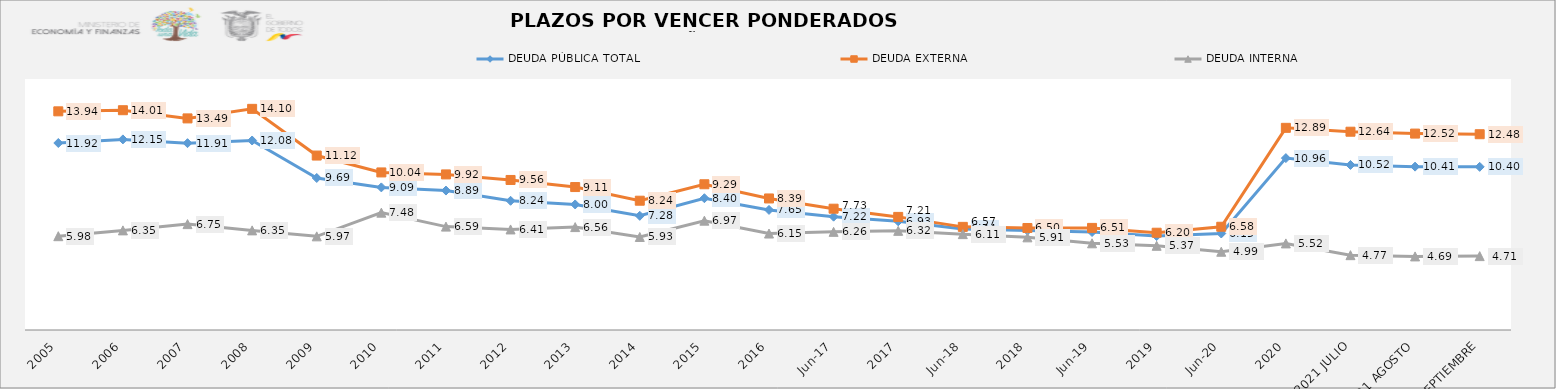
| Category | DEUDA PÚBLICA TOTAL | DEUDA EXTERNA  | DEUDA INTERNA |
|---|---|---|---|
| 2005 | 11.92 | 13.939 | 5.98 |
| 2006 | 12.15 | 14.01 | 6.35 |
| 2007 | 11.91 | 13.489 | 6.75 |
| 2008 | 12.08 | 14.097 | 6.35 |
| 2009 | 9.69 | 11.12 | 5.97 |
| 2010 | 9.09 | 10.045 | 7.48 |
| 2011 | 8.889 | 9.918 | 6.59 |
| 2012 | 8.237 | 9.564 | 6.41 |
| 2013 | 8.003 | 9.112 | 6.56 |
| 2014 | 7.278 | 8.241 | 5.93 |
| 2015 | 8.401 | 9.29 | 6.969 |
| 2016 | 7.655 | 8.385 | 6.149 |
| jun-17 | 7.224 | 7.733 | 6.257 |
| 2017 | 6.927 | 7.21 | 6.32 |
| jun-18 | 6.439 | 6.574 | 6.111 |
| 2018 | 6.337 | 6.503 | 5.906 |
| jun-19 | 6.246 | 6.509 | 5.526 |
| 2019 | 5.988 | 6.201 | 5.368 |
| jun-20 | 6.152 | 6.581 | 4.989 |
| 2020 | 10.957 | 12.887 | 5.519 |
| 2021 JULIO | 10.52 | 12.64 | 4.77 |
| 2021 AGOSTO | 10.414 | 12.52 | 4.69 |
| 2021 SEPTIEMBRE | 10.4 | 12.48 | 4.71 |